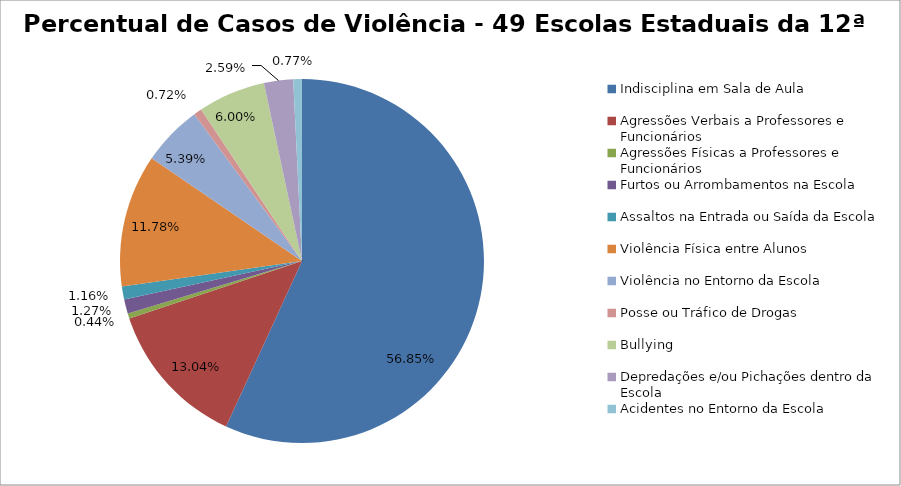
| Category | Percentual |
|---|---|
| Indisciplina em Sala de Aula | 0.569 |
| Agressões Verbais a Professores e Funcionários | 0.13 |
| Agressões Físicas a Professores e Funcionários | 0.004 |
| Furtos ou Arrombamentos na Escola | 0.013 |
| Assaltos na Entrada ou Saída da Escola | 0.012 |
| Violência Física entre Alunos | 0.118 |
| Violência no Entorno da Escola | 0.054 |
| Posse ou Tráfico de Drogas | 0.007 |
| Bullying | 0.06 |
| Depredações e/ou Pichações dentro da Escola | 0.026 |
| Acidentes no Entorno da Escola | 0.008 |